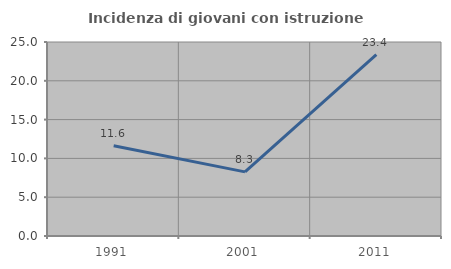
| Category | Incidenza di giovani con istruzione universitaria |
|---|---|
| 1991.0 | 11.628 |
| 2001.0 | 8.264 |
| 2011.0 | 23.377 |